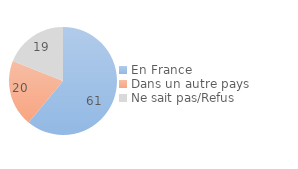
| Category | Series 0 |
|---|---|
| En France | 61 |
| Dans un autre pays | 20 |
| Ne sait pas/Refus | 19 |